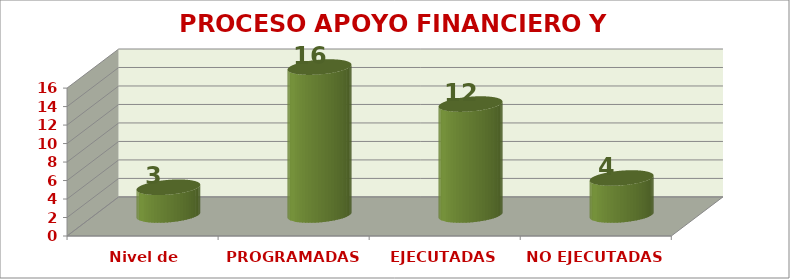
| Category | PROCESO APOYO FINANCIERO Y CONTABLE |
|---|---|
| Nivel de satisfacción | 3 |
| PROGRAMADAS | 16 |
| EJECUTADAS | 12 |
| NO EJECUTADAS | 4 |